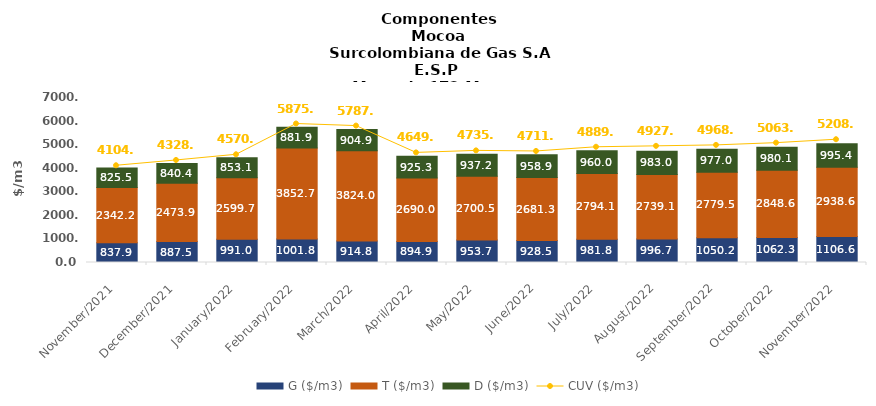
| Category | G ($/m3) | T ($/m3) | D ($/m3) |
|---|---|---|---|
| 2021-11-01 | 837.85 | 2342.16 | 825.45 |
| 2021-12-01 | 887.54 | 2473.88 | 840.42 |
| 2022-01-01 | 990.98 | 2599.65 | 853.11 |
| 2022-02-01 | 1001.77 | 3852.68 | 881.93 |
| 2022-03-01 | 914.81 | 3823.95 | 904.86 |
| 2022-04-01 | 894.94 | 2689.95 | 925.27 |
| 2022-05-01 | 953.73 | 2700.46 | 937.18 |
| 2022-06-01 | 928.46 | 2681.27 | 958.88 |
| 2022-07-01 | 981.79 | 2794.1 | 959.99 |
| 2022-08-01 | 996.74 | 2739.11 | 983.01 |
| 2022-09-01 | 1050.2 | 2779.53 | 976.98 |
| 2022-10-01 | 1062.28 | 2848.55 | 980.12 |
| 2022-11-01 | 1106.58 | 2938.59 | 995.43 |